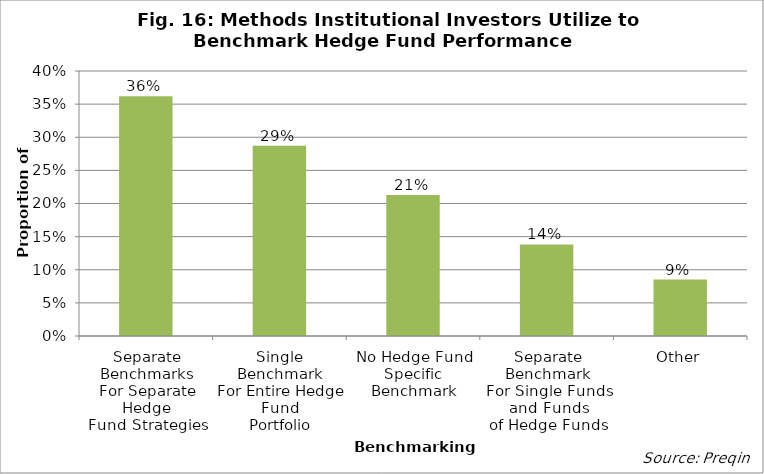
| Category | Proportion |
|---|---|
| Separate Benchmarks
For Separate Hedge
Fund Strategies | 0.362 |
| Single Benchmark
For Entire Hedge Fund
Portfolio | 0.287 |
| No Hedge Fund
Specific Benchmark | 0.213 |
| Separate Benchmark
For Single Funds and Funds
of Hedge Funds | 0.138 |
| Other | 0.085 |